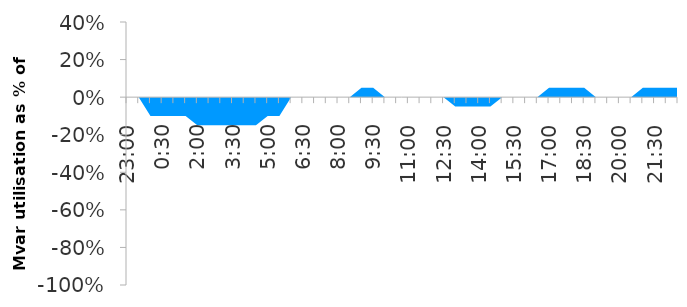
| Category | Series 0 |
|---|---|
| 0.9583333333333334 | 0 |
| 0.9791666666666666 | 0 |
| 0.0 | -0.1 |
| 0.020833333333333332 | -0.1 |
| 0.041666666666666664 | -0.1 |
| 0.0625 | -0.1 |
| 0.08333333333333333 | -0.15 |
| 0.10416666666666667 | -0.15 |
| 0.125 | -0.15 |
| 0.14583333333333334 | -0.15 |
| 0.16666666666666666 | -0.15 |
| 0.1875 | -0.15 |
| 0.20833333333333334 | -0.1 |
| 0.22916666666666666 | -0.1 |
| 0.25 | 0 |
| 0.2708333333333333 | 0 |
| 0.2916666666666667 | 0 |
| 0.3125 | 0 |
| 0.3333333333333333 | 0 |
| 0.3541666666666667 | 0 |
| 0.375 | 0.05 |
| 0.3958333333333333 | 0.05 |
| 0.4166666666666667 | 0 |
| 0.4375 | 0 |
| 0.4583333333333333 | 0 |
| 0.4791666666666667 | 0 |
| 0.5 | 0 |
| 0.5208333333333334 | 0 |
| 0.5416666666666666 | -0.05 |
| 0.5625 | -0.05 |
| 0.5833333333333334 | -0.05 |
| 0.6041666666666666 | -0.05 |
| 0.625 | 0 |
| 0.6458333333333334 | 0 |
| 0.6666666666666666 | 0 |
| 0.6875 | 0 |
| 0.7083333333333334 | 0.05 |
| 0.7291666666666666 | 0.05 |
| 0.75 | 0.05 |
| 0.7708333333333334 | 0.05 |
| 0.7916666666666666 | 0 |
| 0.8125 | 0 |
| 0.8333333333333334 | 0 |
| 0.8541666666666666 | 0 |
| 0.875 | 0.05 |
| 0.8958333333333334 | 0.05 |
| 0.9166666666666666 | 0.05 |
| 0.9375 | 0.05 |